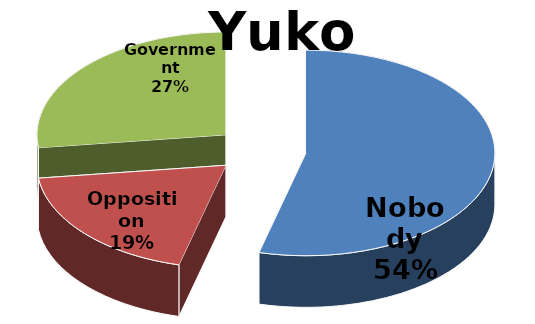
| Category | Yukon |
|---|---|
| Nobody | 0.54 |
| Opposition | 0.19 |
| Government | 0.27 |